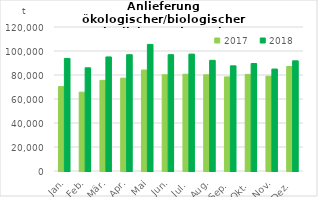
| Category | 2017 | 2018 |
|---|---|---|
| Jan. | 70330.127 | 93838.541 |
| Feb. | 65694.657 | 85997.268 |
| Mär. | 75533.301 | 95045.854 |
| Apr. | 77378.195 | 96908.391 |
| Mai | 84146.522 | 105453.392 |
| Jun. | 80209.173 | 96906.435 |
| Jul. | 80637.01 | 97411.701 |
| Aug. | 80136.623 | 92234.437 |
| Sep. | 78406.509 | 87638.685 |
| Okt. | 80522.426 | 89580.429 |
| Nov. | 78991.121 | 84970.128 |
| Dez. | 87094.98 | 91835.323 |